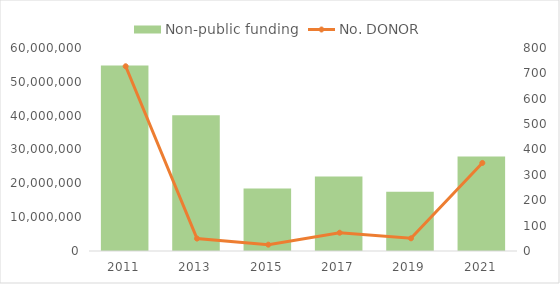
| Category | Non-public funding |
|---|---|
| 2011.0 | 54851590 |
| 2013.0 | 40142948 |
| 2015.0 | 18490000 |
| 2017.0 | 22045036 |
| 2019.0 | 17525302 |
| 2021.0 | 27933208.895 |